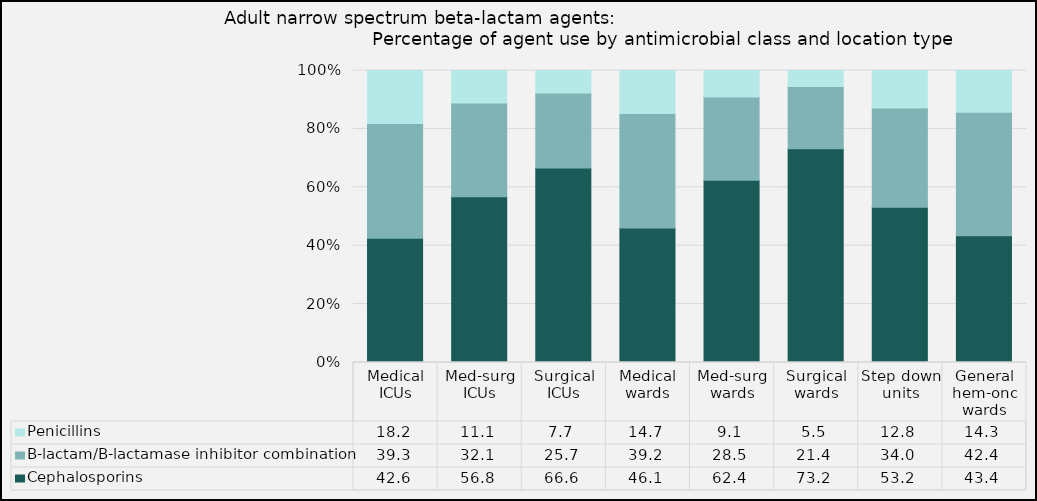
| Category | Cephalosporins | B-lactam/B-lactamase inhibitor combination | Penicillins |
|---|---|---|---|
| Medical ICUs | 42.57 | 39.27 | 18.15 |
| Med-surg ICUs | 56.8 | 32.12 | 11.09 |
| Surgical ICUs | 66.58 | 25.74 | 7.68 |
| Medical wards | 46.06 | 39.21 | 14.73 |
| Med-surg wards | 62.44 | 28.48 | 9.07 |
| Surgical wards | 73.18 | 21.36 | 5.46 |
| Step down units | 53.17 | 34 | 12.83 |
| General hem-onc wards | 43.38 | 42.35 | 14.27 |